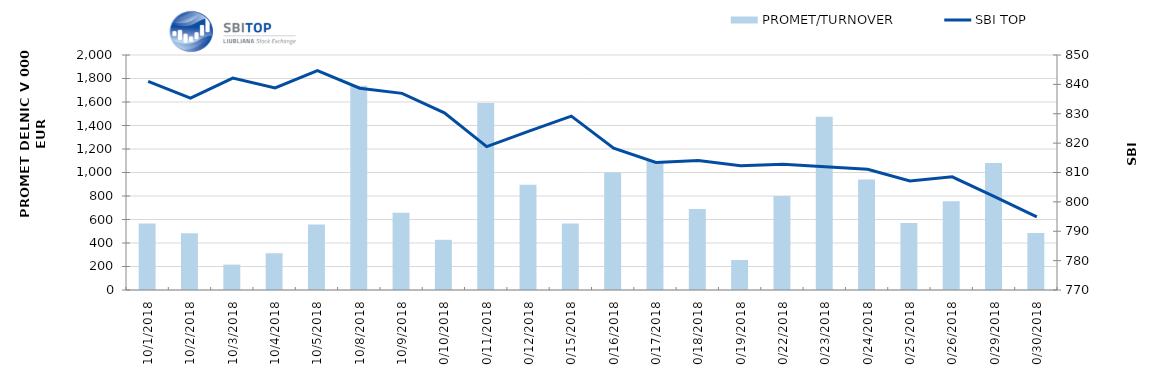
| Category | PROMET/TURNOVER |
|---|---|
| 10/1/18 | 565 |
| 10/2/18 | 484 |
| 10/3/18 | 216 |
| 10/4/18 | 313 |
| 10/5/18 | 557 |
| 10/8/18 | 1739 |
| 10/9/18 | 658 |
| 10/10/18 | 427 |
| 10/11/18 | 1592 |
| 10/12/18 | 895 |
| 10/15/18 | 567 |
| 10/16/18 | 999 |
| 10/17/18 | 1098 |
| 10/18/18 | 689 |
| 10/19/18 | 255 |
| 10/22/18 | 799 |
| 10/23/18 | 1475 |
| 10/24/18 | 941 |
| 10/25/18 | 570 |
| 10/26/18 | 755 |
| 10/29/18 | 1081 |
| 10/30/18 | 486 |